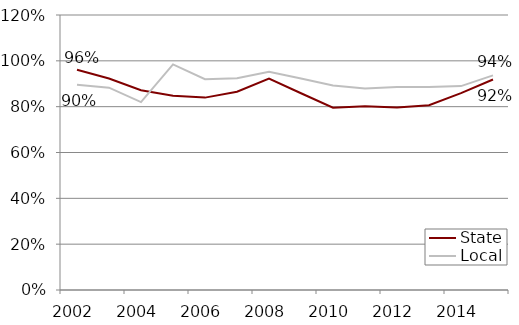
| Category | State | Local |
|---|---|---|
| 2002.0 | 0.961 | 0.895 |
| 2003.0 | 0.923 | 0.883 |
| 2004.0 | 0.872 | 0.82 |
| 2005.0 | 0.848 | 0.984 |
| 2006.0 | 0.839 | 0.92 |
| 2007.0 | 0.865 | 0.924 |
| 2008.0 | 0.922 | 0.953 |
| 2009.0 | 0.859 | 0.923 |
| 2010.0 | 0.795 | 0.892 |
| 2011.0 | 0.802 | 0.88 |
| 2012.0 | 0.796 | 0.885 |
| 2013.0 | 0.807 | 0.886 |
| 2014.0 | 0.859 | 0.89 |
| 2015.0 | 0.919 | 0.937 |